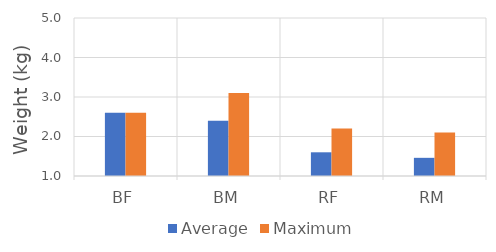
| Category | Average | Maximum |
|---|---|---|
| BF | 2.6 | 2.6 |
| BM | 2.4 | 3.1 |
| RF | 1.6 | 2.2 |
| RM | 1.46 | 2.1 |